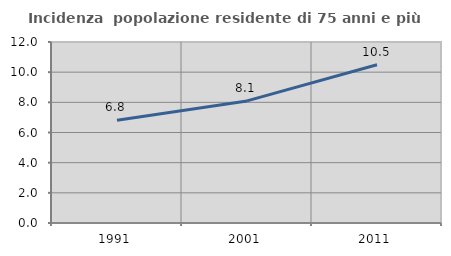
| Category | Incidenza  popolazione residente di 75 anni e più |
|---|---|
| 1991.0 | 6.809 |
| 2001.0 | 8.093 |
| 2011.0 | 10.49 |